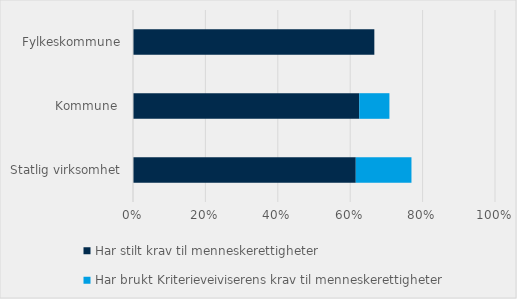
| Category | Har stilt krav til menneskerettigheter | Har brukt Kriterieveiviserens krav til menneskerettigheter |
|---|---|---|
| Statlig virksomhet | 0.615 | 0.154 |
| Kommune  | 0.625 | 0.083 |
| Fylkeskommune | 0.667 | 0 |